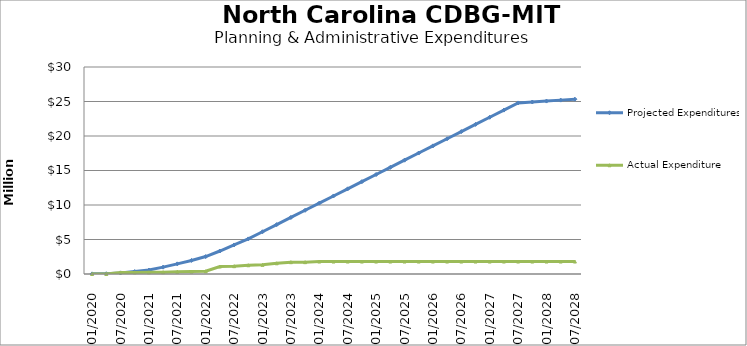
| Category | Projected Expenditures | Actual Expenditure |
|---|---|---|
| 01/2020 | 18934.446 | 0 |
| 04/2020 | 37847.561 | 0 |
| 07/2020 | 161413.244 | 222942.19 |
| 10/2020 | 353066.139 | 233141.15 |
| 01/2021 | 574980.018 | 240779.15 |
| 04/2021 | 993687.28 | 256066.95 |
| 07/2021 | 1469133.887 | 317236 |
| 10/2021 | 1967276.231 | 346652.92 |
| 01/2022 | 2525940.542 | 393251.51 |
| 04/2022 | 3331348.257 | 1084981.7 |
| 07/2022 | 4208625.807 | 1134493.7 |
| 10/2022 | 5085903.358 | 1265968.7 |
| 01/2023 | 6123018.358 | 1332367.7 |
| 04/2023 | 7160131.358 | 1551669.25 |
| 07/2023 | 8197244.358 | 1713080.4 |
| 10/2023 | 9234357.358 | 1715181.96 |
| 01/2024 | 10271470.358 | 1805284.87 |
| 04/2024 | 11308583.358 | 1805284.87 |
| 07/2024 | 12345696.358 | 1805284.87 |
| 10/2024 | 13382809.358 | 1805284.87 |
| 01/2025 | 14419922.358 | 1805284.87 |
| 04/2025 | 15457035.358 | 1805284.87 |
| 07/2025 | 16494148.358 | 1805284.87 |
| 10/2025 | 17531261.358 | 1805284.87 |
| 01/2026 | 18568374.358 | 1805284.87 |
| 04/2026 | 19605487.358 | 1805284.87 |
| 07/2026 | 20642600.358 | 1805284.87 |
| 10/2026 | 21679713.358 | 1805284.87 |
| 01/2027 | 22716826.358 | 1805284.87 |
| 04/2027 | 23753939.358 | 1805284.87 |
| 07/2027 | 24791052.358 | 1805284.87 |
| 10/2027 | 24927226.784 | 1805284.87 |
| 01/2028 | 25063401.21 | 1805284.87 |
| 04/2028 | 25199575.636 | 1805284.87 |
| 07/2028 | 25335750.061 | 1805284.87 |